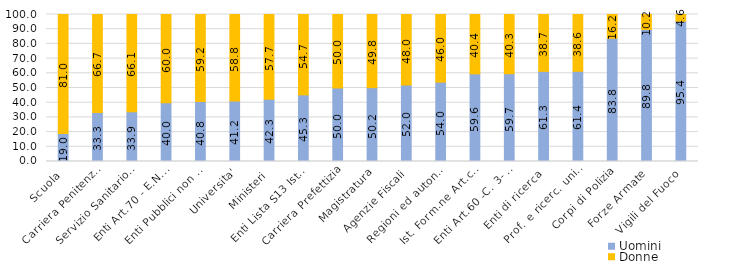
| Category | Uomini | Donne |
|---|---|---|
| Scuola | 18.994 | 81.006 |
| Carriera Penitenziaria | 33.333 | 66.667 |
| Servizio Sanitario Nazionale | 33.895 | 66.105 |
| Enti Art.70 - E.N.A.C. | 40 | 60 |
| Enti Pubblici non economici | 40.796 | 59.204 |
| Universita' | 41.195 | 58.805 |
| Ministeri | 42.302 | 57.698 |
| Enti Lista S13 Istat | 45.312 | 54.688 |
| Carriera Prefettizia | 50 | 50 |
| Magistratura | 50.233 | 49.767 |
| Agenzie Fiscali | 52.029 | 47.971 |
| Regioni ed autonomie locali | 54.004 | 45.996 |
| Ist. Form.ne Art.co Mus.le | 59.615 | 40.385 |
| Enti Art.60 -C. 3- D.165/01 | 59.74 | 40.26 |
| Enti di ricerca | 61.321 | 38.679 |
| Prof. e ricerc. universitari | 61.368 | 38.632 |
| Corpi di Polizia | 83.82 | 16.18 |
| Forze Armate | 89.817 | 10.183 |
| Vigili del Fuoco | 95.432 | 4.568 |